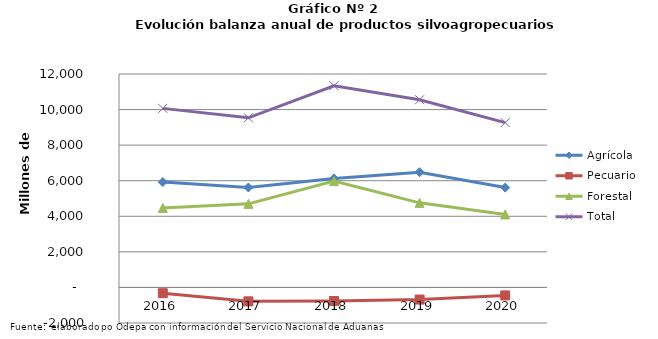
| Category | Agrícola | Pecuario | Forestal | Total |
|---|---|---|---|---|
| 2016.0 | 5924661 | -325421 | 4468104 | 10067344 |
| 2017.0 | 5619304 | -782654 | 4700192 | 9536842 |
| 2018.0 | 6126434 | -761998 | 5976134 | 11340570 |
| 2019.0 | 6480026 | -681604 | 4755333 | 10553755 |
| 2020.0 | 5612972 | -450212 | 4105622 | 9268382 |